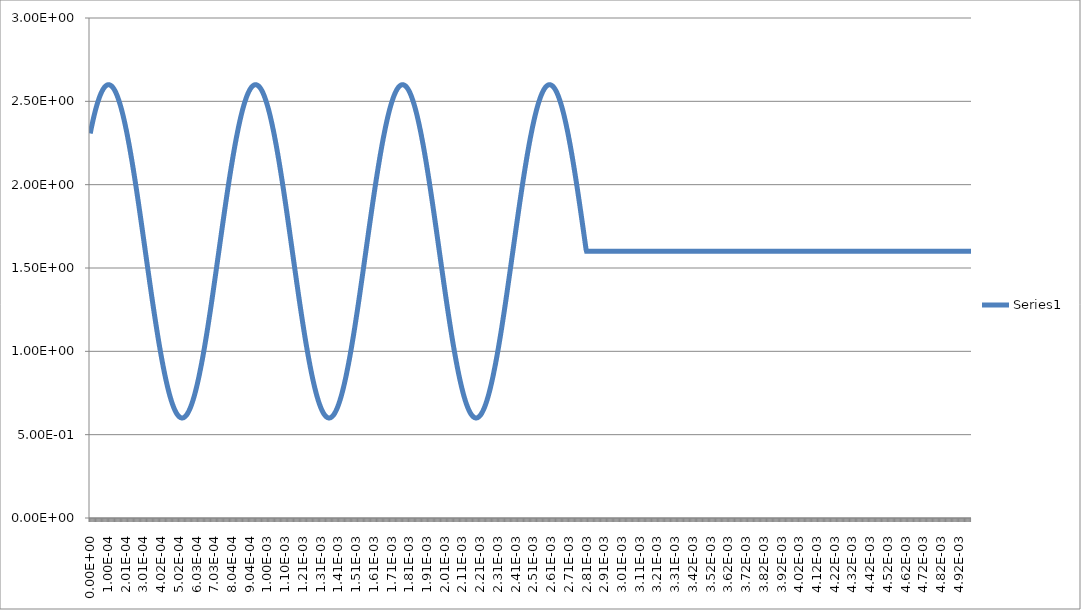
| Category | Series 0 |
|---|---|
| 0.0 | 2.307 |
| 2.45e-06 | 2.32 |
| 4.9e-06 | 2.333 |
| 7.35e-06 | 2.345 |
| 9.8e-06 | 2.357 |
| 1.225e-05 | 2.369 |
| 1.47e-05 | 2.381 |
| 1.715e-05 | 2.392 |
| 1.96e-05 | 2.404 |
| 2.205e-05 | 2.414 |
| 2.45e-05 | 2.425 |
| 2.695e-05 | 2.435 |
| 2.94e-05 | 2.445 |
| 3.185e-05 | 2.455 |
| 3.43e-05 | 2.464 |
| 3.675e-05 | 2.474 |
| 3.92e-05 | 2.482 |
| 4.165e-05 | 2.491 |
| 4.41e-05 | 2.499 |
| 4.655e-05 | 2.507 |
| 4.9e-05 | 2.515 |
| 5.145e-05 | 2.522 |
| 5.39e-05 | 2.529 |
| 5.635e-05 | 2.536 |
| 5.88e-05 | 2.542 |
| 6.125e-05 | 2.548 |
| 6.37e-05 | 2.554 |
| 6.615e-05 | 2.559 |
| 6.86e-05 | 2.564 |
| 7.105e-05 | 2.569 |
| 7.35e-05 | 2.573 |
| 7.595e-05 | 2.578 |
| 7.84e-05 | 2.581 |
| 8.085e-05 | 2.585 |
| 8.33e-05 | 2.588 |
| 8.575e-05 | 2.59 |
| 8.82e-05 | 2.593 |
| 9.065e-05 | 2.595 |
| 9.31e-05 | 2.597 |
| 9.555e-05 | 2.598 |
| 9.8e-05 | 2.599 |
| 0.00010045 | 2.6 |
| 0.0001029 | 2.6 |
| 0.00010535 | 2.6 |
| 0.0001078 | 2.6 |
| 0.00011025 | 2.599 |
| 0.0001127 | 2.598 |
| 0.00011515 | 2.597 |
| 0.0001176 | 2.595 |
| 0.00012005 | 2.593 |
| 0.0001225 | 2.59 |
| 0.00012495 | 2.588 |
| 0.0001274 | 2.585 |
| 0.00012985 | 2.581 |
| 0.0001323 | 2.578 |
| 0.00013475 | 2.573 |
| 0.0001372 | 2.569 |
| 0.00013965 | 2.564 |
| 0.0001421 | 2.559 |
| 0.00014455 | 2.554 |
| 0.000147 | 2.548 |
| 0.00014945 | 2.542 |
| 0.0001519 | 2.536 |
| 0.00015435 | 2.529 |
| 0.0001568 | 2.522 |
| 0.00015925 | 2.515 |
| 0.0001617 | 2.507 |
| 0.00016415 | 2.499 |
| 0.0001666 | 2.491 |
| 0.00016905 | 2.482 |
| 0.0001715 | 2.474 |
| 0.00017395 | 2.464 |
| 0.0001764 | 2.455 |
| 0.00017885 | 2.445 |
| 0.0001813 | 2.435 |
| 0.00018375 | 2.425 |
| 0.0001862 | 2.414 |
| 0.00018865 | 2.404 |
| 0.0001911 | 2.392 |
| 0.00019355 | 2.381 |
| 0.000196 | 2.369 |
| 0.00019845 | 2.357 |
| 0.0002009 | 2.345 |
| 0.00020335 | 2.333 |
| 0.0002058 | 2.32 |
| 0.00020825 | 2.307 |
| 0.0002107 | 2.294 |
| 0.00021315 | 2.28 |
| 0.0002156 | 2.267 |
| 0.00021805 | 2.253 |
| 0.0002205 | 2.239 |
| 0.00022295 | 2.225 |
| 0.0002254 | 2.21 |
| 0.00022785 | 2.195 |
| 0.0002303 | 2.18 |
| 0.00023275 | 2.165 |
| 0.0002352 | 2.15 |
| 0.00023765 | 2.134 |
| 0.0002401 | 2.119 |
| 0.00024255 | 2.103 |
| 0.000245 | 2.087 |
| 0.00024745 | 2.07 |
| 0.0002499 | 2.054 |
| 0.00025235 | 2.037 |
| 0.0002548 | 2.021 |
| 0.00025725 | 2.004 |
| 0.0002597 | 1.987 |
| 0.00026215 | 1.97 |
| 0.0002646 | 1.953 |
| 0.00026705 | 1.935 |
| 0.0002695 | 1.918 |
| 0.00027195 | 1.9 |
| 0.0002744 | 1.883 |
| 0.00027685 | 1.865 |
| 0.0002793 | 1.847 |
| 0.00028175 | 1.829 |
| 0.0002842 | 1.811 |
| 0.00028665 | 1.793 |
| 0.0002891 | 1.775 |
| 0.00029155 | 1.756 |
| 0.000294 | 1.738 |
| 0.00029645 | 1.72 |
| 0.0002989 | 1.701 |
| 0.00030135 | 1.683 |
| 0.0003038 | 1.665 |
| 0.00030625 | 1.646 |
| 0.0003087 | 1.628 |
| 0.00031115 | 1.609 |
| 0.0003136 | 1.591 |
| 0.00031605 | 1.572 |
| 0.0003185 | 1.554 |
| 0.00032095 | 1.535 |
| 0.0003234 | 1.517 |
| 0.00032585 | 1.499 |
| 0.0003283 | 1.48 |
| 0.00033075 | 1.462 |
| 0.0003332 | 1.444 |
| 0.00033565 | 1.425 |
| 0.0003381 | 1.407 |
| 0.00034055 | 1.389 |
| 0.000343 | 1.371 |
| 0.00034545 | 1.353 |
| 0.0003479 | 1.335 |
| 0.00035035 | 1.317 |
| 0.0003528 | 1.3 |
| 0.00035525 | 1.282 |
| 0.0003577 | 1.265 |
| 0.00036015 | 1.247 |
| 0.0003626 | 1.23 |
| 0.00036505 | 1.213 |
| 0.0003675 | 1.196 |
| 0.00036995 | 1.179 |
| 0.0003724 | 1.163 |
| 0.00037485 | 1.146 |
| 0.0003773 | 1.13 |
| 0.00037975 | 1.113 |
| 0.0003822 | 1.097 |
| 0.00038465 | 1.081 |
| 0.0003871 | 1.066 |
| 0.00038955 | 1.05 |
| 0.000392 | 1.035 |
| 0.00039445 | 1.02 |
| 0.0003969 | 1.005 |
| 0.00039935 | 0.99 |
| 0.0004018 | 0.975 |
| 0.00040425 | 0.961 |
| 0.0004067 | 0.947 |
| 0.00040915 | 0.933 |
| 0.0004116 | 0.92 |
| 0.00041405 | 0.906 |
| 0.0004165 | 0.893 |
| 0.00041895 | 0.88 |
| 0.0004214 | 0.867 |
| 0.00042385 | 0.855 |
| 0.0004263 | 0.843 |
| 0.00042875 | 0.831 |
| 0.0004312 | 0.819 |
| 0.00043365 | 0.808 |
| 0.0004361 | 0.796 |
| 0.00043855 | 0.786 |
| 0.000441 | 0.775 |
| 0.00044345 | 0.765 |
| 0.0004459 | 0.755 |
| 0.00044835 | 0.745 |
| 0.0004508 | 0.736 |
| 0.00045325 | 0.726 |
| 0.0004557 | 0.718 |
| 0.00045815 | 0.709 |
| 0.0004606 | 0.701 |
| 0.00046305 | 0.693 |
| 0.0004655 | 0.685 |
| 0.00046795 | 0.678 |
| 0.0004704 | 0.671 |
| 0.00047285 | 0.664 |
| 0.0004753 | 0.658 |
| 0.00047775 | 0.652 |
| 0.0004802 | 0.646 |
| 0.00048265 | 0.641 |
| 0.0004851 | 0.636 |
| 0.00048755 | 0.631 |
| 0.00049 | 0.627 |
| 0.00049245 | 0.622 |
| 0.0004949 | 0.619 |
| 0.00049735 | 0.615 |
| 0.0004998 | 0.612 |
| 0.00050225 | 0.61 |
| 0.0005047 | 0.607 |
| 0.00050715 | 0.605 |
| 0.0005096 | 0.603 |
| 0.00051205 | 0.602 |
| 0.0005145 | 0.601 |
| 0.00051695 | 0.6 |
| 0.0005194 | 0.6 |
| 0.00052185 | 0.6 |
| 0.0005243 | 0.6 |
| 0.00052675 | 0.601 |
| 0.0005292 | 0.602 |
| 0.00053165 | 0.603 |
| 0.0005341 | 0.605 |
| 0.00053655 | 0.607 |
| 0.000539 | 0.61 |
| 0.00054145 | 0.612 |
| 0.0005439 | 0.615 |
| 0.00054635 | 0.619 |
| 0.0005488 | 0.622 |
| 0.00055125 | 0.627 |
| 0.0005537 | 0.631 |
| 0.00055615 | 0.636 |
| 0.0005586 | 0.641 |
| 0.00056105 | 0.646 |
| 0.0005635 | 0.652 |
| 0.00056595 | 0.658 |
| 0.0005684 | 0.664 |
| 0.00057085 | 0.671 |
| 0.0005733 | 0.678 |
| 0.00057575 | 0.685 |
| 0.0005782 | 0.693 |
| 0.00058065 | 0.701 |
| 0.0005831 | 0.709 |
| 0.00058555 | 0.718 |
| 0.000588 | 0.726 |
| 0.00059045 | 0.736 |
| 0.0005929 | 0.745 |
| 0.00059535 | 0.755 |
| 0.0005978 | 0.765 |
| 0.00060025 | 0.775 |
| 0.0006027 | 0.786 |
| 0.00060515 | 0.796 |
| 0.0006076 | 0.808 |
| 0.00061005 | 0.819 |
| 0.0006125 | 0.831 |
| 0.00061495 | 0.843 |
| 0.0006174 | 0.855 |
| 0.00061985 | 0.867 |
| 0.0006223 | 0.88 |
| 0.00062475 | 0.893 |
| 0.0006272 | 0.906 |
| 0.00062965 | 0.92 |
| 0.0006321 | 0.933 |
| 0.00063455 | 0.947 |
| 0.000637 | 0.961 |
| 0.00063945 | 0.975 |
| 0.0006419 | 0.99 |
| 0.00064435 | 1.005 |
| 0.0006468 | 1.02 |
| 0.00064925 | 1.035 |
| 0.0006517 | 1.05 |
| 0.00065415 | 1.066 |
| 0.0006566 | 1.081 |
| 0.00065905 | 1.097 |
| 0.0006615 | 1.113 |
| 0.00066395 | 1.13 |
| 0.0006664 | 1.146 |
| 0.00066885 | 1.163 |
| 0.0006713 | 1.179 |
| 0.00067375 | 1.196 |
| 0.0006762 | 1.213 |
| 0.00067865 | 1.23 |
| 0.0006811 | 1.247 |
| 0.00068355 | 1.265 |
| 0.000686 | 1.282 |
| 0.00068845 | 1.3 |
| 0.0006909 | 1.317 |
| 0.00069335 | 1.335 |
| 0.0006958 | 1.353 |
| 0.00069825 | 1.371 |
| 0.0007007 | 1.389 |
| 0.00070315 | 1.407 |
| 0.0007056 | 1.425 |
| 0.00070805 | 1.444 |
| 0.0007105 | 1.462 |
| 0.00071295 | 1.48 |
| 0.0007154 | 1.499 |
| 0.00071785 | 1.517 |
| 0.0007203 | 1.535 |
| 0.00072275 | 1.554 |
| 0.0007252 | 1.572 |
| 0.00072765 | 1.591 |
| 0.0007301 | 1.609 |
| 0.00073255 | 1.628 |
| 0.000735 | 1.646 |
| 0.00073745 | 1.665 |
| 0.0007399 | 1.683 |
| 0.00074235 | 1.701 |
| 0.0007448 | 1.72 |
| 0.00074725 | 1.738 |
| 0.0007497 | 1.756 |
| 0.00075215 | 1.775 |
| 0.0007546 | 1.793 |
| 0.00075705 | 1.811 |
| 0.0007595 | 1.829 |
| 0.00076195 | 1.847 |
| 0.0007644 | 1.865 |
| 0.00076685 | 1.883 |
| 0.0007693 | 1.9 |
| 0.00077175 | 1.918 |
| 0.0007742 | 1.935 |
| 0.00077665 | 1.953 |
| 0.0007791 | 1.97 |
| 0.00078155 | 1.987 |
| 0.000784 | 2.004 |
| 0.00078645 | 2.021 |
| 0.0007889 | 2.037 |
| 0.00079135 | 2.054 |
| 0.0007938 | 2.07 |
| 0.00079625 | 2.087 |
| 0.0007987 | 2.103 |
| 0.00080115 | 2.119 |
| 0.0008036 | 2.134 |
| 0.00080605 | 2.15 |
| 0.0008085 | 2.165 |
| 0.00081095 | 2.18 |
| 0.0008134 | 2.195 |
| 0.00081585 | 2.21 |
| 0.0008183 | 2.225 |
| 0.00082075 | 2.239 |
| 0.0008232 | 2.253 |
| 0.00082565 | 2.267 |
| 0.0008281 | 2.28 |
| 0.00083055 | 2.294 |
| 0.000833 | 2.307 |
| 0.00083545 | 2.32 |
| 0.0008379 | 2.333 |
| 0.00084035 | 2.345 |
| 0.0008428 | 2.357 |
| 0.00084525 | 2.369 |
| 0.0008477 | 2.381 |
| 0.00085015 | 2.392 |
| 0.0008526 | 2.404 |
| 0.00085505 | 2.414 |
| 0.0008575 | 2.425 |
| 0.00085995 | 2.435 |
| 0.0008624 | 2.445 |
| 0.00086485 | 2.455 |
| 0.0008673 | 2.464 |
| 0.00086975 | 2.474 |
| 0.0008722 | 2.482 |
| 0.00087465 | 2.491 |
| 0.0008771 | 2.499 |
| 0.00087955 | 2.507 |
| 0.000882 | 2.515 |
| 0.00088445 | 2.522 |
| 0.0008869 | 2.529 |
| 0.00088935 | 2.536 |
| 0.0008918 | 2.542 |
| 0.00089425 | 2.548 |
| 0.0008967 | 2.554 |
| 0.00089915 | 2.559 |
| 0.0009016 | 2.564 |
| 0.00090405 | 2.569 |
| 0.0009065 | 2.573 |
| 0.00090895 | 2.578 |
| 0.0009114 | 2.581 |
| 0.00091385 | 2.585 |
| 0.0009163 | 2.588 |
| 0.00091875 | 2.59 |
| 0.0009212 | 2.593 |
| 0.00092365 | 2.595 |
| 0.0009261 | 2.597 |
| 0.00092855 | 2.598 |
| 0.000931 | 2.599 |
| 0.00093345 | 2.6 |
| 0.0009359 | 2.6 |
| 0.00093835 | 2.6 |
| 0.0009408 | 2.6 |
| 0.00094325 | 2.599 |
| 0.0009457 | 2.598 |
| 0.00094815 | 2.597 |
| 0.0009506 | 2.595 |
| 0.00095305 | 2.593 |
| 0.0009555 | 2.59 |
| 0.00095795 | 2.588 |
| 0.0009604 | 2.585 |
| 0.00096285 | 2.581 |
| 0.0009653 | 2.578 |
| 0.00096775 | 2.573 |
| 0.0009702 | 2.569 |
| 0.00097265 | 2.564 |
| 0.0009751 | 2.559 |
| 0.00097755 | 2.554 |
| 0.00098 | 2.548 |
| 0.00098245 | 2.542 |
| 0.0009849 | 2.536 |
| 0.00098735 | 2.529 |
| 0.0009898 | 2.522 |
| 0.00099225 | 2.515 |
| 0.0009947 | 2.507 |
| 0.00099715 | 2.499 |
| 0.0009996 | 2.491 |
| 0.00100205 | 2.482 |
| 0.0010045 | 2.474 |
| 0.00100695 | 2.464 |
| 0.0010094 | 2.455 |
| 0.00101185 | 2.445 |
| 0.0010143 | 2.435 |
| 0.00101675 | 2.425 |
| 0.0010192 | 2.414 |
| 0.00102165 | 2.404 |
| 0.0010241 | 2.392 |
| 0.00102655 | 2.381 |
| 0.001029 | 2.369 |
| 0.00103145 | 2.357 |
| 0.0010339 | 2.345 |
| 0.00103635 | 2.333 |
| 0.0010388 | 2.32 |
| 0.00104125 | 2.307 |
| 0.0010437 | 2.294 |
| 0.00104615 | 2.28 |
| 0.0010486 | 2.267 |
| 0.00105105 | 2.253 |
| 0.0010535 | 2.239 |
| 0.00105595 | 2.225 |
| 0.0010584 | 2.21 |
| 0.00106085 | 2.195 |
| 0.0010633 | 2.18 |
| 0.00106575 | 2.165 |
| 0.0010682 | 2.15 |
| 0.00107065 | 2.134 |
| 0.0010731 | 2.119 |
| 0.00107555 | 2.103 |
| 0.001078 | 2.087 |
| 0.00108045 | 2.07 |
| 0.0010829 | 2.054 |
| 0.00108535 | 2.037 |
| 0.0010878 | 2.021 |
| 0.00109025 | 2.004 |
| 0.0010927 | 1.987 |
| 0.00109515 | 1.97 |
| 0.0010976 | 1.953 |
| 0.00110005 | 1.935 |
| 0.0011025 | 1.918 |
| 0.00110495 | 1.9 |
| 0.0011074 | 1.883 |
| 0.00110985 | 1.865 |
| 0.0011123 | 1.847 |
| 0.00111475 | 1.829 |
| 0.0011172 | 1.811 |
| 0.00111965 | 1.793 |
| 0.0011221 | 1.775 |
| 0.00112455 | 1.756 |
| 0.001127 | 1.738 |
| 0.00112945 | 1.72 |
| 0.0011319 | 1.701 |
| 0.00113435 | 1.683 |
| 0.0011368 | 1.665 |
| 0.00113925 | 1.646 |
| 0.0011417 | 1.628 |
| 0.00114415 | 1.609 |
| 0.0011466 | 1.591 |
| 0.00114905 | 1.572 |
| 0.0011515 | 1.554 |
| 0.00115395 | 1.535 |
| 0.0011564 | 1.517 |
| 0.00115885 | 1.499 |
| 0.0011613 | 1.48 |
| 0.00116375 | 1.462 |
| 0.0011662 | 1.444 |
| 0.00116865 | 1.425 |
| 0.0011711 | 1.407 |
| 0.00117355 | 1.389 |
| 0.001176 | 1.371 |
| 0.00117845 | 1.353 |
| 0.0011809 | 1.335 |
| 0.00118335 | 1.317 |
| 0.0011858 | 1.3 |
| 0.00118825 | 1.282 |
| 0.0011907 | 1.265 |
| 0.00119315 | 1.247 |
| 0.0011956 | 1.23 |
| 0.00119805 | 1.213 |
| 0.0012005 | 1.196 |
| 0.00120295 | 1.179 |
| 0.0012054 | 1.163 |
| 0.00120785 | 1.146 |
| 0.0012103 | 1.13 |
| 0.00121275 | 1.113 |
| 0.0012152 | 1.097 |
| 0.00121765 | 1.081 |
| 0.0012201 | 1.066 |
| 0.00122255 | 1.05 |
| 0.001225 | 1.035 |
| 0.00122745 | 1.02 |
| 0.0012299 | 1.005 |
| 0.00123235 | 0.99 |
| 0.0012348 | 0.975 |
| 0.00123725 | 0.961 |
| 0.0012397 | 0.947 |
| 0.00124215 | 0.933 |
| 0.0012446 | 0.92 |
| 0.00124705 | 0.906 |
| 0.0012495 | 0.893 |
| 0.00125195 | 0.88 |
| 0.0012544 | 0.867 |
| 0.00125685 | 0.855 |
| 0.0012593 | 0.843 |
| 0.00126175 | 0.831 |
| 0.0012642 | 0.819 |
| 0.00126665 | 0.808 |
| 0.0012691 | 0.796 |
| 0.00127155 | 0.786 |
| 0.001274 | 0.775 |
| 0.00127645 | 0.765 |
| 0.0012789 | 0.755 |
| 0.00128135 | 0.745 |
| 0.0012838 | 0.736 |
| 0.00128625 | 0.726 |
| 0.0012887 | 0.718 |
| 0.00129115 | 0.709 |
| 0.0012936 | 0.701 |
| 0.00129605 | 0.693 |
| 0.0012985 | 0.685 |
| 0.00130095 | 0.678 |
| 0.0013034 | 0.671 |
| 0.00130585 | 0.664 |
| 0.0013083 | 0.658 |
| 0.00131075 | 0.652 |
| 0.0013132 | 0.646 |
| 0.00131565 | 0.641 |
| 0.0013181 | 0.636 |
| 0.00132055 | 0.631 |
| 0.001323 | 0.627 |
| 0.00132545 | 0.622 |
| 0.0013279 | 0.619 |
| 0.00133035 | 0.615 |
| 0.0013328 | 0.612 |
| 0.00133525 | 0.61 |
| 0.0013377 | 0.607 |
| 0.00134015 | 0.605 |
| 0.0013426 | 0.603 |
| 0.00134505 | 0.602 |
| 0.0013475 | 0.601 |
| 0.00134995 | 0.6 |
| 0.0013524 | 0.6 |
| 0.00135485 | 0.6 |
| 0.0013573 | 0.6 |
| 0.00135975 | 0.601 |
| 0.0013622 | 0.602 |
| 0.00136465 | 0.603 |
| 0.0013671 | 0.605 |
| 0.00136955 | 0.607 |
| 0.001372 | 0.61 |
| 0.00137445 | 0.612 |
| 0.0013769 | 0.615 |
| 0.00137935 | 0.619 |
| 0.0013818 | 0.622 |
| 0.00138425 | 0.627 |
| 0.0013867 | 0.631 |
| 0.00138915 | 0.636 |
| 0.0013916 | 0.641 |
| 0.00139405 | 0.646 |
| 0.0013965 | 0.652 |
| 0.00139895 | 0.658 |
| 0.0014014 | 0.664 |
| 0.00140385 | 0.671 |
| 0.0014063 | 0.678 |
| 0.00140875 | 0.685 |
| 0.0014112 | 0.693 |
| 0.00141365 | 0.701 |
| 0.0014161 | 0.709 |
| 0.00141855 | 0.718 |
| 0.001421 | 0.726 |
| 0.00142345 | 0.736 |
| 0.0014259 | 0.745 |
| 0.00142835 | 0.755 |
| 0.0014308 | 0.765 |
| 0.00143325 | 0.775 |
| 0.0014357 | 0.786 |
| 0.00143815 | 0.796 |
| 0.0014406 | 0.808 |
| 0.00144305 | 0.819 |
| 0.0014455 | 0.831 |
| 0.00144795 | 0.843 |
| 0.0014504 | 0.855 |
| 0.00145285 | 0.867 |
| 0.0014553 | 0.88 |
| 0.00145775 | 0.893 |
| 0.0014602 | 0.906 |
| 0.00146265 | 0.92 |
| 0.0014651 | 0.933 |
| 0.00146755 | 0.947 |
| 0.00147 | 0.961 |
| 0.00147245 | 0.975 |
| 0.0014749 | 0.99 |
| 0.00147735 | 1.005 |
| 0.0014798 | 1.02 |
| 0.00148225 | 1.035 |
| 0.0014847 | 1.05 |
| 0.00148715 | 1.066 |
| 0.0014896 | 1.081 |
| 0.00149205 | 1.097 |
| 0.0014945 | 1.113 |
| 0.00149695 | 1.13 |
| 0.0014994 | 1.146 |
| 0.00150185 | 1.163 |
| 0.0015043 | 1.179 |
| 0.00150675 | 1.196 |
| 0.0015092 | 1.213 |
| 0.00151165 | 1.23 |
| 0.0015141 | 1.247 |
| 0.00151655 | 1.265 |
| 0.001519 | 1.282 |
| 0.00152145 | 1.3 |
| 0.0015239 | 1.317 |
| 0.00152635 | 1.335 |
| 0.0015288 | 1.353 |
| 0.00153125 | 1.371 |
| 0.0015337 | 1.389 |
| 0.00153615 | 1.407 |
| 0.0015386 | 1.425 |
| 0.00154105 | 1.444 |
| 0.0015435 | 1.462 |
| 0.00154595 | 1.48 |
| 0.0015484 | 1.499 |
| 0.00155085 | 1.517 |
| 0.0015533 | 1.535 |
| 0.00155575 | 1.554 |
| 0.0015582 | 1.572 |
| 0.00156065 | 1.591 |
| 0.0015631 | 1.609 |
| 0.00156555 | 1.628 |
| 0.001568 | 1.646 |
| 0.00157045 | 1.665 |
| 0.0015729 | 1.683 |
| 0.00157535 | 1.701 |
| 0.0015778 | 1.72 |
| 0.00158025 | 1.738 |
| 0.0015827 | 1.756 |
| 0.00158515 | 1.775 |
| 0.0015876 | 1.793 |
| 0.00159005 | 1.811 |
| 0.0015925 | 1.829 |
| 0.00159495 | 1.847 |
| 0.0015974 | 1.865 |
| 0.00159985 | 1.883 |
| 0.0016023 | 1.9 |
| 0.00160475 | 1.918 |
| 0.0016072 | 1.935 |
| 0.00160965 | 1.953 |
| 0.0016121 | 1.97 |
| 0.00161455 | 1.987 |
| 0.001617 | 2.004 |
| 0.00161945 | 2.021 |
| 0.0016219 | 2.037 |
| 0.00162435 | 2.054 |
| 0.0016268 | 2.07 |
| 0.00162925 | 2.087 |
| 0.0016317 | 2.103 |
| 0.00163415 | 2.119 |
| 0.0016366 | 2.134 |
| 0.00163905 | 2.15 |
| 0.0016415 | 2.165 |
| 0.00164395 | 2.18 |
| 0.0016464 | 2.195 |
| 0.00164885 | 2.21 |
| 0.0016513 | 2.225 |
| 0.00165375 | 2.239 |
| 0.0016562 | 2.253 |
| 0.00165865 | 2.267 |
| 0.0016611 | 2.28 |
| 0.00166355 | 2.294 |
| 0.001666 | 2.307 |
| 0.00166845 | 2.32 |
| 0.0016709 | 2.333 |
| 0.00167335 | 2.345 |
| 0.0016758 | 2.357 |
| 0.00167825 | 2.369 |
| 0.0016807 | 2.381 |
| 0.00168315 | 2.392 |
| 0.0016856 | 2.404 |
| 0.00168805 | 2.414 |
| 0.0016905 | 2.425 |
| 0.00169295 | 2.435 |
| 0.0016954 | 2.445 |
| 0.00169785 | 2.455 |
| 0.0017003 | 2.464 |
| 0.00170275 | 2.474 |
| 0.0017052 | 2.482 |
| 0.00170765 | 2.491 |
| 0.0017101 | 2.499 |
| 0.00171255 | 2.507 |
| 0.001715 | 2.515 |
| 0.00171745 | 2.522 |
| 0.0017199 | 2.529 |
| 0.00172235 | 2.536 |
| 0.0017248 | 2.542 |
| 0.00172725 | 2.548 |
| 0.0017297 | 2.554 |
| 0.00173215 | 2.559 |
| 0.0017346 | 2.564 |
| 0.00173705 | 2.569 |
| 0.0017395 | 2.573 |
| 0.00174195 | 2.578 |
| 0.0017444 | 2.581 |
| 0.00174685 | 2.585 |
| 0.0017493 | 2.588 |
| 0.00175175 | 2.59 |
| 0.0017542 | 2.593 |
| 0.00175665 | 2.595 |
| 0.0017591 | 2.597 |
| 0.00176155 | 2.598 |
| 0.001764 | 2.599 |
| 0.00176645 | 2.6 |
| 0.0017689 | 2.6 |
| 0.00177135 | 2.6 |
| 0.0017738 | 2.6 |
| 0.00177625 | 2.599 |
| 0.0017787 | 2.598 |
| 0.00178115 | 2.597 |
| 0.0017836 | 2.595 |
| 0.00178605 | 2.593 |
| 0.0017885 | 2.59 |
| 0.00179095 | 2.588 |
| 0.0017934 | 2.585 |
| 0.00179585 | 2.581 |
| 0.0017983 | 2.578 |
| 0.00180075 | 2.573 |
| 0.0018032 | 2.569 |
| 0.00180565 | 2.564 |
| 0.0018081 | 2.559 |
| 0.00181055 | 2.554 |
| 0.001813 | 2.548 |
| 0.00181545 | 2.542 |
| 0.0018179 | 2.536 |
| 0.00182035 | 2.529 |
| 0.0018228 | 2.522 |
| 0.00182525 | 2.515 |
| 0.0018277 | 2.507 |
| 0.00183015 | 2.499 |
| 0.0018326 | 2.491 |
| 0.00183505 | 2.482 |
| 0.0018375 | 2.474 |
| 0.00183995 | 2.464 |
| 0.0018424 | 2.455 |
| 0.00184485 | 2.445 |
| 0.0018473 | 2.435 |
| 0.00184975 | 2.425 |
| 0.0018522 | 2.414 |
| 0.00185465 | 2.404 |
| 0.0018571 | 2.392 |
| 0.00185955 | 2.381 |
| 0.001862 | 2.369 |
| 0.00186445 | 2.357 |
| 0.0018669 | 2.345 |
| 0.00186935 | 2.333 |
| 0.0018718 | 2.32 |
| 0.00187425 | 2.307 |
| 0.0018767 | 2.294 |
| 0.00187915 | 2.28 |
| 0.0018816 | 2.267 |
| 0.00188405 | 2.253 |
| 0.0018865 | 2.239 |
| 0.00188895 | 2.225 |
| 0.0018914 | 2.21 |
| 0.00189385 | 2.195 |
| 0.0018963 | 2.18 |
| 0.00189875 | 2.165 |
| 0.0019012 | 2.15 |
| 0.00190365 | 2.134 |
| 0.0019061 | 2.119 |
| 0.00190855 | 2.103 |
| 0.001911 | 2.087 |
| 0.00191345 | 2.07 |
| 0.0019159 | 2.054 |
| 0.00191835 | 2.037 |
| 0.0019208 | 2.021 |
| 0.00192325 | 2.004 |
| 0.0019257 | 1.987 |
| 0.00192815 | 1.97 |
| 0.0019306 | 1.953 |
| 0.00193305 | 1.935 |
| 0.0019355 | 1.918 |
| 0.00193795 | 1.9 |
| 0.0019404 | 1.883 |
| 0.00194285 | 1.865 |
| 0.0019453 | 1.847 |
| 0.00194775 | 1.829 |
| 0.0019502 | 1.811 |
| 0.00195265 | 1.793 |
| 0.0019551 | 1.775 |
| 0.00195755 | 1.756 |
| 0.00196 | 1.738 |
| 0.00196245 | 1.72 |
| 0.0019649 | 1.701 |
| 0.00196735 | 1.683 |
| 0.0019698 | 1.665 |
| 0.00197225 | 1.646 |
| 0.0019747 | 1.628 |
| 0.00197715 | 1.609 |
| 0.0019796 | 1.591 |
| 0.00198205 | 1.572 |
| 0.0019845 | 1.554 |
| 0.00198695 | 1.535 |
| 0.0019894 | 1.517 |
| 0.00199185 | 1.499 |
| 0.0019943 | 1.48 |
| 0.00199675 | 1.462 |
| 0.0019992 | 1.444 |
| 0.00200165 | 1.425 |
| 0.0020041 | 1.407 |
| 0.00200655 | 1.389 |
| 0.002009 | 1.371 |
| 0.00201145 | 1.353 |
| 0.0020139 | 1.335 |
| 0.00201635 | 1.317 |
| 0.0020188 | 1.3 |
| 0.00202125 | 1.282 |
| 0.0020237 | 1.265 |
| 0.00202615 | 1.247 |
| 0.0020286 | 1.23 |
| 0.00203105 | 1.213 |
| 0.0020335 | 1.196 |
| 0.00203595 | 1.179 |
| 0.0020384 | 1.163 |
| 0.00204085 | 1.146 |
| 0.0020433 | 1.13 |
| 0.00204575 | 1.113 |
| 0.0020482 | 1.097 |
| 0.00205065 | 1.081 |
| 0.0020531 | 1.066 |
| 0.00205555 | 1.05 |
| 0.002058 | 1.035 |
| 0.00206045 | 1.02 |
| 0.0020629 | 1.005 |
| 0.00206535 | 0.99 |
| 0.0020678 | 0.975 |
| 0.00207025 | 0.961 |
| 0.0020727 | 0.947 |
| 0.00207515 | 0.933 |
| 0.0020776 | 0.92 |
| 0.00208005 | 0.906 |
| 0.0020825 | 0.893 |
| 0.00208495 | 0.88 |
| 0.0020874 | 0.867 |
| 0.00208985 | 0.855 |
| 0.0020923 | 0.843 |
| 0.00209475 | 0.831 |
| 0.0020972 | 0.819 |
| 0.00209965 | 0.808 |
| 0.0021021 | 0.796 |
| 0.00210455 | 0.786 |
| 0.002107 | 0.775 |
| 0.00210945 | 0.765 |
| 0.0021119 | 0.755 |
| 0.00211435 | 0.745 |
| 0.0021168 | 0.736 |
| 0.00211925 | 0.726 |
| 0.0021217 | 0.718 |
| 0.00212415 | 0.709 |
| 0.0021266 | 0.701 |
| 0.00212905 | 0.693 |
| 0.0021315 | 0.685 |
| 0.00213395 | 0.678 |
| 0.0021364 | 0.671 |
| 0.00213885 | 0.664 |
| 0.0021413 | 0.658 |
| 0.00214375 | 0.652 |
| 0.0021462 | 0.646 |
| 0.00214865 | 0.641 |
| 0.0021511 | 0.636 |
| 0.00215355 | 0.631 |
| 0.002156 | 0.627 |
| 0.00215845 | 0.622 |
| 0.0021609 | 0.619 |
| 0.00216335 | 0.615 |
| 0.0021658 | 0.612 |
| 0.00216825 | 0.61 |
| 0.0021707 | 0.607 |
| 0.00217315 | 0.605 |
| 0.0021756 | 0.603 |
| 0.00217805 | 0.602 |
| 0.0021805 | 0.601 |
| 0.00218295 | 0.6 |
| 0.0021854 | 0.6 |
| 0.00218785 | 0.6 |
| 0.0021903 | 0.6 |
| 0.00219275 | 0.601 |
| 0.0021952 | 0.602 |
| 0.00219765 | 0.603 |
| 0.0022001 | 0.605 |
| 0.00220255 | 0.607 |
| 0.002205 | 0.61 |
| 0.00220745 | 0.612 |
| 0.0022099 | 0.615 |
| 0.00221235 | 0.619 |
| 0.0022148 | 0.622 |
| 0.00221725 | 0.627 |
| 0.0022197 | 0.631 |
| 0.00222215 | 0.636 |
| 0.0022246 | 0.641 |
| 0.00222705 | 0.646 |
| 0.0022295 | 0.652 |
| 0.00223195 | 0.658 |
| 0.0022344 | 0.664 |
| 0.00223685 | 0.671 |
| 0.0022393 | 0.678 |
| 0.00224175 | 0.685 |
| 0.0022442 | 0.693 |
| 0.00224665 | 0.701 |
| 0.0022491 | 0.709 |
| 0.00225155 | 0.718 |
| 0.002254 | 0.726 |
| 0.00225645 | 0.736 |
| 0.0022589 | 0.745 |
| 0.00226135 | 0.755 |
| 0.0022638 | 0.765 |
| 0.00226625 | 0.775 |
| 0.0022687 | 0.786 |
| 0.00227115 | 0.796 |
| 0.0022736 | 0.808 |
| 0.00227605 | 0.819 |
| 0.0022785 | 0.831 |
| 0.00228095 | 0.843 |
| 0.0022834 | 0.855 |
| 0.00228585 | 0.867 |
| 0.0022883 | 0.88 |
| 0.00229075 | 0.893 |
| 0.0022932 | 0.906 |
| 0.00229565 | 0.92 |
| 0.0022981 | 0.933 |
| 0.00230055 | 0.947 |
| 0.002303 | 0.961 |
| 0.00230545 | 0.975 |
| 0.0023079 | 0.99 |
| 0.00231035 | 1.005 |
| 0.0023128 | 1.02 |
| 0.00231525 | 1.035 |
| 0.0023177 | 1.05 |
| 0.00232015 | 1.066 |
| 0.0023226 | 1.081 |
| 0.00232505 | 1.097 |
| 0.0023275 | 1.113 |
| 0.00232995 | 1.13 |
| 0.0023324 | 1.146 |
| 0.00233485 | 1.163 |
| 0.0023373 | 1.179 |
| 0.00233975 | 1.196 |
| 0.0023422 | 1.213 |
| 0.00234465 | 1.23 |
| 0.0023471 | 1.247 |
| 0.00234955 | 1.265 |
| 0.002352 | 1.282 |
| 0.00235445 | 1.3 |
| 0.0023569 | 1.317 |
| 0.00235935 | 1.335 |
| 0.0023618 | 1.353 |
| 0.00236425 | 1.371 |
| 0.0023667 | 1.389 |
| 0.00236915 | 1.407 |
| 0.0023716 | 1.425 |
| 0.00237405 | 1.444 |
| 0.0023765 | 1.462 |
| 0.00237895 | 1.48 |
| 0.0023814 | 1.499 |
| 0.00238385 | 1.517 |
| 0.0023863 | 1.535 |
| 0.00238875 | 1.554 |
| 0.0023912 | 1.572 |
| 0.00239365 | 1.591 |
| 0.0023961 | 1.609 |
| 0.00239855 | 1.628 |
| 0.002401 | 1.646 |
| 0.00240345 | 1.665 |
| 0.0024059 | 1.683 |
| 0.00240835 | 1.701 |
| 0.0024108 | 1.72 |
| 0.00241325 | 1.738 |
| 0.0024157 | 1.756 |
| 0.00241815 | 1.775 |
| 0.0024206 | 1.793 |
| 0.00242305 | 1.811 |
| 0.0024255 | 1.829 |
| 0.00242795 | 1.847 |
| 0.0024304 | 1.865 |
| 0.00243285 | 1.883 |
| 0.0024353 | 1.9 |
| 0.00243775 | 1.918 |
| 0.0024402 | 1.935 |
| 0.00244265 | 1.953 |
| 0.0024451 | 1.97 |
| 0.00244755 | 1.987 |
| 0.00245 | 2.004 |
| 0.00245245 | 2.021 |
| 0.0024549 | 2.037 |
| 0.00245735 | 2.054 |
| 0.0024598 | 2.07 |
| 0.00246225 | 2.087 |
| 0.0024647 | 2.103 |
| 0.00246715 | 2.119 |
| 0.0024696 | 2.134 |
| 0.00247205 | 2.15 |
| 0.0024745 | 2.165 |
| 0.00247695 | 2.18 |
| 0.0024794 | 2.195 |
| 0.00248185 | 2.21 |
| 0.0024843 | 2.225 |
| 0.00248675 | 2.239 |
| 0.0024892 | 2.253 |
| 0.00249165 | 2.267 |
| 0.0024941 | 2.28 |
| 0.00249655 | 2.294 |
| 0.002499 | 2.307 |
| 0.00250145 | 2.32 |
| 0.0025039 | 2.333 |
| 0.00250635 | 2.345 |
| 0.0025088 | 2.357 |
| 0.00251125 | 2.369 |
| 0.0025137 | 2.381 |
| 0.00251615 | 2.392 |
| 0.0025186 | 2.404 |
| 0.00252105 | 2.414 |
| 0.0025235 | 2.425 |
| 0.00252595 | 2.435 |
| 0.0025284 | 2.445 |
| 0.00253085 | 2.455 |
| 0.0025333 | 2.464 |
| 0.00253575 | 2.474 |
| 0.0025382 | 2.482 |
| 0.00254065 | 2.491 |
| 0.0025431 | 2.499 |
| 0.00254555 | 2.507 |
| 0.002548 | 2.515 |
| 0.00255045 | 2.522 |
| 0.0025529 | 2.529 |
| 0.00255535 | 2.536 |
| 0.0025578 | 2.542 |
| 0.00256025 | 2.548 |
| 0.0025627 | 2.554 |
| 0.00256515 | 2.559 |
| 0.0025676 | 2.564 |
| 0.00257005 | 2.569 |
| 0.0025725 | 2.573 |
| 0.00257495 | 2.578 |
| 0.0025774 | 2.581 |
| 0.00257985 | 2.585 |
| 0.0025823 | 2.588 |
| 0.00258475 | 2.59 |
| 0.0025872 | 2.593 |
| 0.00258965 | 2.595 |
| 0.0025921 | 2.597 |
| 0.00259455 | 2.598 |
| 0.002597 | 2.599 |
| 0.00259945 | 2.6 |
| 0.0026019 | 2.6 |
| 0.00260435 | 2.6 |
| 0.0026068 | 2.6 |
| 0.00260925 | 2.599 |
| 0.0026117 | 2.598 |
| 0.00261415 | 2.597 |
| 0.0026166 | 2.595 |
| 0.00261905 | 2.593 |
| 0.0026215 | 2.59 |
| 0.00262395 | 2.588 |
| 0.0026264 | 2.585 |
| 0.00262885 | 2.581 |
| 0.0026313 | 2.578 |
| 0.00263375 | 2.573 |
| 0.0026362 | 2.569 |
| 0.00263865 | 2.564 |
| 0.0026411 | 2.559 |
| 0.00264355 | 2.554 |
| 0.002646 | 2.548 |
| 0.00264845 | 2.542 |
| 0.0026509 | 2.536 |
| 0.00265335 | 2.529 |
| 0.0026558 | 2.522 |
| 0.00265825 | 2.515 |
| 0.0026607 | 2.507 |
| 0.00266315 | 2.499 |
| 0.0026656 | 2.491 |
| 0.00266805 | 2.482 |
| 0.0026705 | 2.474 |
| 0.00267295 | 2.464 |
| 0.0026754 | 2.455 |
| 0.00267785 | 2.445 |
| 0.0026803 | 2.435 |
| 0.00268275 | 2.425 |
| 0.0026852 | 2.414 |
| 0.00268765 | 2.404 |
| 0.0026901 | 2.392 |
| 0.00269255 | 2.381 |
| 0.002695 | 2.369 |
| 0.00269745 | 2.357 |
| 0.0026999 | 2.345 |
| 0.00270235 | 2.333 |
| 0.0027048 | 2.32 |
| 0.00270725 | 2.307 |
| 0.0027097 | 2.294 |
| 0.00271215 | 2.28 |
| 0.0027146 | 2.267 |
| 0.00271705 | 2.253 |
| 0.0027195 | 2.239 |
| 0.00272195 | 2.225 |
| 0.0027244 | 2.21 |
| 0.00272685 | 2.195 |
| 0.0027293 | 2.18 |
| 0.00273175 | 2.165 |
| 0.0027342 | 2.15 |
| 0.00273665 | 2.134 |
| 0.0027391 | 2.119 |
| 0.00274155 | 2.103 |
| 0.002744 | 2.087 |
| 0.00274645 | 2.07 |
| 0.0027489 | 2.054 |
| 0.00275135 | 2.037 |
| 0.0027538 | 2.021 |
| 0.00275625 | 2.004 |
| 0.0027587 | 1.987 |
| 0.00276115 | 1.97 |
| 0.0027636 | 1.953 |
| 0.00276605 | 1.935 |
| 0.0027685 | 1.918 |
| 0.00277095 | 1.9 |
| 0.0027734 | 1.883 |
| 0.00277585 | 1.865 |
| 0.0027783 | 1.847 |
| 0.00278075 | 1.829 |
| 0.0027832 | 1.811 |
| 0.00278565 | 1.793 |
| 0.0027881 | 1.775 |
| 0.00279055 | 1.756 |
| 0.002793 | 1.738 |
| 0.00279545 | 1.72 |
| 0.0027979 | 1.701 |
| 0.00280035 | 1.683 |
| 0.0028028 | 1.665 |
| 0.00280525 | 1.646 |
| 0.0028077 | 1.628 |
| 0.00281015 | 1.609 |
| 0.0028126 | 1.6 |
| 0.00281505 | 1.6 |
| 0.0028175 | 1.6 |
| 0.00281995 | 1.6 |
| 0.0028224 | 1.6 |
| 0.00282485 | 1.6 |
| 0.0028273 | 1.6 |
| 0.00282975 | 1.6 |
| 0.0028322 | 1.6 |
| 0.00283465 | 1.6 |
| 0.0028371 | 1.6 |
| 0.00283955 | 1.6 |
| 0.002842 | 1.6 |
| 0.00284445 | 1.6 |
| 0.0028469 | 1.6 |
| 0.00284935 | 1.6 |
| 0.0028518 | 1.6 |
| 0.00285425 | 1.6 |
| 0.0028567 | 1.6 |
| 0.00285915 | 1.6 |
| 0.0028616 | 1.6 |
| 0.00286405 | 1.6 |
| 0.0028665 | 1.6 |
| 0.00286895 | 1.6 |
| 0.0028714 | 1.6 |
| 0.00287385 | 1.6 |
| 0.0028763 | 1.6 |
| 0.00287875 | 1.6 |
| 0.0028812 | 1.6 |
| 0.00288365 | 1.6 |
| 0.0028861 | 1.6 |
| 0.00288855 | 1.6 |
| 0.002891 | 1.6 |
| 0.00289345 | 1.6 |
| 0.0028959 | 1.6 |
| 0.00289835 | 1.6 |
| 0.0029008 | 1.6 |
| 0.00290325 | 1.6 |
| 0.0029057 | 1.6 |
| 0.00290815 | 1.6 |
| 0.0029106 | 1.6 |
| 0.00291305 | 1.6 |
| 0.0029155 | 1.6 |
| 0.00291795 | 1.6 |
| 0.0029204 | 1.6 |
| 0.00292285 | 1.6 |
| 0.0029253 | 1.6 |
| 0.00292775 | 1.6 |
| 0.0029302 | 1.6 |
| 0.00293265 | 1.6 |
| 0.0029351 | 1.6 |
| 0.00293755 | 1.6 |
| 0.00294 | 1.6 |
| 0.00294245 | 1.6 |
| 0.0029449 | 1.6 |
| 0.00294735 | 1.6 |
| 0.0029498 | 1.6 |
| 0.00295225 | 1.6 |
| 0.0029547 | 1.6 |
| 0.00295715 | 1.6 |
| 0.0029596 | 1.6 |
| 0.00296205 | 1.6 |
| 0.0029645 | 1.6 |
| 0.00296695 | 1.6 |
| 0.0029694 | 1.6 |
| 0.00297185 | 1.6 |
| 0.0029743 | 1.6 |
| 0.00297675 | 1.6 |
| 0.0029792 | 1.6 |
| 0.00298165 | 1.6 |
| 0.0029841 | 1.6 |
| 0.00298655 | 1.6 |
| 0.002989 | 1.6 |
| 0.00299145 | 1.6 |
| 0.0029939 | 1.6 |
| 0.00299635 | 1.6 |
| 0.0029988 | 1.6 |
| 0.00300125 | 1.6 |
| 0.0030037 | 1.6 |
| 0.00300615 | 1.6 |
| 0.0030086 | 1.6 |
| 0.00301105 | 1.6 |
| 0.0030135 | 1.6 |
| 0.00301595 | 1.6 |
| 0.0030184 | 1.6 |
| 0.00302085 | 1.6 |
| 0.0030233 | 1.6 |
| 0.00302575 | 1.6 |
| 0.0030282 | 1.6 |
| 0.00303065 | 1.6 |
| 0.0030331 | 1.6 |
| 0.00303555 | 1.6 |
| 0.003038 | 1.6 |
| 0.00304045 | 1.6 |
| 0.0030429 | 1.6 |
| 0.00304535 | 1.6 |
| 0.0030478 | 1.6 |
| 0.00305025 | 1.6 |
| 0.0030527 | 1.6 |
| 0.00305515 | 1.6 |
| 0.0030576 | 1.6 |
| 0.00306005 | 1.6 |
| 0.0030625 | 1.6 |
| 0.00306495 | 1.6 |
| 0.0030674 | 1.6 |
| 0.00306985 | 1.6 |
| 0.0030723 | 1.6 |
| 0.00307475 | 1.6 |
| 0.0030772 | 1.6 |
| 0.00307965 | 1.6 |
| 0.0030821 | 1.6 |
| 0.00308455 | 1.6 |
| 0.003087 | 1.6 |
| 0.00308945 | 1.6 |
| 0.0030919 | 1.6 |
| 0.00309435 | 1.6 |
| 0.0030968 | 1.6 |
| 0.00309925 | 1.6 |
| 0.0031017 | 1.6 |
| 0.00310415 | 1.6 |
| 0.0031066 | 1.6 |
| 0.00310905 | 1.6 |
| 0.0031115 | 1.6 |
| 0.00311395 | 1.6 |
| 0.0031164 | 1.6 |
| 0.00311885 | 1.6 |
| 0.0031213 | 1.6 |
| 0.00312375 | 1.6 |
| 0.0031262 | 1.6 |
| 0.00312865 | 1.6 |
| 0.0031311 | 1.6 |
| 0.00313355 | 1.6 |
| 0.003136 | 1.6 |
| 0.00313845 | 1.6 |
| 0.0031409 | 1.6 |
| 0.00314335 | 1.6 |
| 0.0031458 | 1.6 |
| 0.00314825 | 1.6 |
| 0.0031507 | 1.6 |
| 0.00315315 | 1.6 |
| 0.0031556 | 1.6 |
| 0.00315805 | 1.6 |
| 0.0031605 | 1.6 |
| 0.00316295 | 1.6 |
| 0.0031654 | 1.6 |
| 0.00316785 | 1.6 |
| 0.0031703 | 1.6 |
| 0.00317275 | 1.6 |
| 0.0031752 | 1.6 |
| 0.00317765 | 1.6 |
| 0.0031801 | 1.6 |
| 0.00318255 | 1.6 |
| 0.003185 | 1.6 |
| 0.00318745 | 1.6 |
| 0.0031899 | 1.6 |
| 0.00319235 | 1.6 |
| 0.0031948 | 1.6 |
| 0.00319725 | 1.6 |
| 0.0031997 | 1.6 |
| 0.00320215 | 1.6 |
| 0.0032046 | 1.6 |
| 0.00320705 | 1.6 |
| 0.0032095 | 1.6 |
| 0.00321195 | 1.6 |
| 0.0032144 | 1.6 |
| 0.00321685 | 1.6 |
| 0.0032193 | 1.6 |
| 0.00322175 | 1.6 |
| 0.0032242 | 1.6 |
| 0.00322665 | 1.6 |
| 0.0032291 | 1.6 |
| 0.00323155 | 1.6 |
| 0.003234 | 1.6 |
| 0.00323645 | 1.6 |
| 0.0032389 | 1.6 |
| 0.00324135 | 1.6 |
| 0.0032438 | 1.6 |
| 0.00324625 | 1.6 |
| 0.0032487 | 1.6 |
| 0.00325115 | 1.6 |
| 0.0032536 | 1.6 |
| 0.00325605 | 1.6 |
| 0.0032585 | 1.6 |
| 0.00326095 | 1.6 |
| 0.0032634 | 1.6 |
| 0.00326585 | 1.6 |
| 0.0032683 | 1.6 |
| 0.00327075 | 1.6 |
| 0.0032732 | 1.6 |
| 0.00327565 | 1.6 |
| 0.0032781 | 1.6 |
| 0.00328055 | 1.6 |
| 0.003283 | 1.6 |
| 0.00328545 | 1.6 |
| 0.0032879 | 1.6 |
| 0.00329035 | 1.6 |
| 0.0032928 | 1.6 |
| 0.00329525 | 1.6 |
| 0.0032977 | 1.6 |
| 0.00330015 | 1.6 |
| 0.0033026 | 1.6 |
| 0.00330505 | 1.6 |
| 0.0033075 | 1.6 |
| 0.00330995 | 1.6 |
| 0.0033124 | 1.6 |
| 0.00331485 | 1.6 |
| 0.0033173 | 1.6 |
| 0.00331975 | 1.6 |
| 0.0033222 | 1.6 |
| 0.00332465 | 1.6 |
| 0.0033271 | 1.6 |
| 0.00332955 | 1.6 |
| 0.003332 | 1.6 |
| 0.00333445 | 1.6 |
| 0.0033369 | 1.6 |
| 0.00333935 | 1.6 |
| 0.0033418 | 1.6 |
| 0.00334425 | 1.6 |
| 0.0033467 | 1.6 |
| 0.00334915 | 1.6 |
| 0.0033516 | 1.6 |
| 0.00335405 | 1.6 |
| 0.0033565 | 1.6 |
| 0.00335895 | 1.6 |
| 0.0033614 | 1.6 |
| 0.00336385 | 1.6 |
| 0.0033663 | 1.6 |
| 0.00336875 | 1.6 |
| 0.0033712 | 1.6 |
| 0.00337365 | 1.6 |
| 0.0033761 | 1.6 |
| 0.00337855 | 1.6 |
| 0.003381 | 1.6 |
| 0.00338345 | 1.6 |
| 0.0033859 | 1.6 |
| 0.00338835 | 1.6 |
| 0.0033908 | 1.6 |
| 0.00339325 | 1.6 |
| 0.0033957 | 1.6 |
| 0.00339815 | 1.6 |
| 0.0034006 | 1.6 |
| 0.00340305 | 1.6 |
| 0.0034055 | 1.6 |
| 0.00340795 | 1.6 |
| 0.0034104 | 1.6 |
| 0.00341285 | 1.6 |
| 0.0034153 | 1.6 |
| 0.00341775 | 1.6 |
| 0.0034202 | 1.6 |
| 0.00342265 | 1.6 |
| 0.0034251 | 1.6 |
| 0.00342755 | 1.6 |
| 0.00343 | 1.6 |
| 0.00343245 | 1.6 |
| 0.0034349 | 1.6 |
| 0.00343735 | 1.6 |
| 0.0034398 | 1.6 |
| 0.00344225 | 1.6 |
| 0.0034447 | 1.6 |
| 0.00344715 | 1.6 |
| 0.0034496 | 1.6 |
| 0.00345205 | 1.6 |
| 0.0034545 | 1.6 |
| 0.00345695 | 1.6 |
| 0.0034594 | 1.6 |
| 0.00346185 | 1.6 |
| 0.0034643 | 1.6 |
| 0.00346675 | 1.6 |
| 0.0034692 | 1.6 |
| 0.00347165 | 1.6 |
| 0.0034741 | 1.6 |
| 0.00347655 | 1.6 |
| 0.003479 | 1.6 |
| 0.00348145 | 1.6 |
| 0.0034839 | 1.6 |
| 0.00348635 | 1.6 |
| 0.0034888 | 1.6 |
| 0.00349125 | 1.6 |
| 0.0034937 | 1.6 |
| 0.00349615 | 1.6 |
| 0.0034986 | 1.6 |
| 0.00350105 | 1.6 |
| 0.0035035 | 1.6 |
| 0.00350595 | 1.6 |
| 0.0035084 | 1.6 |
| 0.00351085 | 1.6 |
| 0.0035133 | 1.6 |
| 0.00351575 | 1.6 |
| 0.0035182 | 1.6 |
| 0.00352065 | 1.6 |
| 0.0035231 | 1.6 |
| 0.00352555 | 1.6 |
| 0.003528 | 1.6 |
| 0.00353045 | 1.6 |
| 0.0035329 | 1.6 |
| 0.00353535 | 1.6 |
| 0.0035378 | 1.6 |
| 0.00354025 | 1.6 |
| 0.0035427 | 1.6 |
| 0.00354515 | 1.6 |
| 0.0035476 | 1.6 |
| 0.00355005 | 1.6 |
| 0.0035525 | 1.6 |
| 0.00355495 | 1.6 |
| 0.0035574 | 1.6 |
| 0.00355985 | 1.6 |
| 0.0035623 | 1.6 |
| 0.00356475 | 1.6 |
| 0.0035672 | 1.6 |
| 0.00356965 | 1.6 |
| 0.0035721 | 1.6 |
| 0.00357455 | 1.6 |
| 0.003577 | 1.6 |
| 0.00357945 | 1.6 |
| 0.0035819 | 1.6 |
| 0.00358435 | 1.6 |
| 0.0035868 | 1.6 |
| 0.00358925 | 1.6 |
| 0.0035917 | 1.6 |
| 0.00359415 | 1.6 |
| 0.0035966 | 1.6 |
| 0.00359905 | 1.6 |
| 0.0036015 | 1.6 |
| 0.00360395 | 1.6 |
| 0.0036064 | 1.6 |
| 0.00360885 | 1.6 |
| 0.0036113 | 1.6 |
| 0.00361375 | 1.6 |
| 0.0036162 | 1.6 |
| 0.00361865 | 1.6 |
| 0.0036211 | 1.6 |
| 0.00362355 | 1.6 |
| 0.003626 | 1.6 |
| 0.00362845 | 1.6 |
| 0.0036309 | 1.6 |
| 0.00363335 | 1.6 |
| 0.0036358 | 1.6 |
| 0.00363825 | 1.6 |
| 0.0036407 | 1.6 |
| 0.00364315 | 1.6 |
| 0.0036456 | 1.6 |
| 0.00364805 | 1.6 |
| 0.0036505 | 1.6 |
| 0.00365295 | 1.6 |
| 0.0036554 | 1.6 |
| 0.00365785 | 1.6 |
| 0.0036603 | 1.6 |
| 0.00366275 | 1.6 |
| 0.0036652 | 1.6 |
| 0.00366765 | 1.6 |
| 0.0036701 | 1.6 |
| 0.00367255 | 1.6 |
| 0.003675 | 1.6 |
| 0.00367745 | 1.6 |
| 0.0036799 | 1.6 |
| 0.00368235 | 1.6 |
| 0.0036848 | 1.6 |
| 0.00368725 | 1.6 |
| 0.0036897 | 1.6 |
| 0.00369215 | 1.6 |
| 0.0036946 | 1.6 |
| 0.00369705 | 1.6 |
| 0.0036995 | 1.6 |
| 0.00370195 | 1.6 |
| 0.0037044 | 1.6 |
| 0.00370685 | 1.6 |
| 0.0037093 | 1.6 |
| 0.00371175 | 1.6 |
| 0.0037142 | 1.6 |
| 0.00371665 | 1.6 |
| 0.0037191 | 1.6 |
| 0.00372155 | 1.6 |
| 0.003724 | 1.6 |
| 0.00372645 | 1.6 |
| 0.0037289 | 1.6 |
| 0.00373135 | 1.6 |
| 0.0037338 | 1.6 |
| 0.00373625 | 1.6 |
| 0.0037387 | 1.6 |
| 0.00374115 | 1.6 |
| 0.0037436 | 1.6 |
| 0.00374605 | 1.6 |
| 0.0037485 | 1.6 |
| 0.00375095 | 1.6 |
| 0.0037534 | 1.6 |
| 0.00375585 | 1.6 |
| 0.0037583 | 1.6 |
| 0.00376075 | 1.6 |
| 0.0037632 | 1.6 |
| 0.00376565 | 1.6 |
| 0.0037681 | 1.6 |
| 0.00377055 | 1.6 |
| 0.003773 | 1.6 |
| 0.00377545 | 1.6 |
| 0.0037779 | 1.6 |
| 0.00378035 | 1.6 |
| 0.0037828 | 1.6 |
| 0.00378525 | 1.6 |
| 0.0037877 | 1.6 |
| 0.00379015 | 1.6 |
| 0.0037926 | 1.6 |
| 0.00379505 | 1.6 |
| 0.0037975 | 1.6 |
| 0.00379995 | 1.6 |
| 0.0038024 | 1.6 |
| 0.00380485 | 1.6 |
| 0.0038073 | 1.6 |
| 0.00380975 | 1.6 |
| 0.0038122 | 1.6 |
| 0.00381465 | 1.6 |
| 0.0038171 | 1.6 |
| 0.00381955 | 1.6 |
| 0.003822 | 1.6 |
| 0.00382445 | 1.6 |
| 0.0038269 | 1.6 |
| 0.00382935 | 1.6 |
| 0.0038318 | 1.6 |
| 0.00383425 | 1.6 |
| 0.0038367 | 1.6 |
| 0.00383915 | 1.6 |
| 0.0038416 | 1.6 |
| 0.00384405 | 1.6 |
| 0.0038465 | 1.6 |
| 0.00384895 | 1.6 |
| 0.0038514 | 1.6 |
| 0.00385385 | 1.6 |
| 0.0038563 | 1.6 |
| 0.00385875 | 1.6 |
| 0.0038612 | 1.6 |
| 0.00386365 | 1.6 |
| 0.0038661 | 1.6 |
| 0.00386855 | 1.6 |
| 0.003871 | 1.6 |
| 0.00387345 | 1.6 |
| 0.0038759 | 1.6 |
| 0.00387835 | 1.6 |
| 0.0038808 | 1.6 |
| 0.00388325 | 1.6 |
| 0.0038857 | 1.6 |
| 0.00388815 | 1.6 |
| 0.0038906 | 1.6 |
| 0.00389305 | 1.6 |
| 0.0038955 | 1.6 |
| 0.00389795 | 1.6 |
| 0.0039004 | 1.6 |
| 0.00390285 | 1.6 |
| 0.0039053 | 1.6 |
| 0.00390775 | 1.6 |
| 0.0039102 | 1.6 |
| 0.00391265 | 1.6 |
| 0.0039151 | 1.6 |
| 0.00391755 | 1.6 |
| 0.00392 | 1.6 |
| 0.00392245 | 1.6 |
| 0.0039249 | 1.6 |
| 0.00392735 | 1.6 |
| 0.0039298 | 1.6 |
| 0.00393225 | 1.6 |
| 0.0039347 | 1.6 |
| 0.00393715 | 1.6 |
| 0.0039396 | 1.6 |
| 0.00394205 | 1.6 |
| 0.0039445 | 1.6 |
| 0.00394695 | 1.6 |
| 0.0039494 | 1.6 |
| 0.00395185 | 1.6 |
| 0.0039543 | 1.6 |
| 0.00395675 | 1.6 |
| 0.0039592 | 1.6 |
| 0.00396165 | 1.6 |
| 0.0039641 | 1.6 |
| 0.00396655 | 1.6 |
| 0.003969 | 1.6 |
| 0.00397145 | 1.6 |
| 0.0039739 | 1.6 |
| 0.00397635 | 1.6 |
| 0.0039788 | 1.6 |
| 0.00398125 | 1.6 |
| 0.0039837 | 1.6 |
| 0.00398615 | 1.6 |
| 0.0039886 | 1.6 |
| 0.00399105 | 1.6 |
| 0.0039935 | 1.6 |
| 0.00399595 | 1.6 |
| 0.0039984 | 1.6 |
| 0.00400085 | 1.6 |
| 0.0040033 | 1.6 |
| 0.00400575 | 1.6 |
| 0.0040082 | 1.6 |
| 0.00401065 | 1.6 |
| 0.0040131 | 1.6 |
| 0.00401555 | 1.6 |
| 0.004018 | 1.6 |
| 0.00402045 | 1.6 |
| 0.0040229 | 1.6 |
| 0.00402535 | 1.6 |
| 0.0040278 | 1.6 |
| 0.00403025 | 1.6 |
| 0.0040327 | 1.6 |
| 0.00403515 | 1.6 |
| 0.0040376 | 1.6 |
| 0.00404005 | 1.6 |
| 0.0040425 | 1.6 |
| 0.00404495 | 1.6 |
| 0.0040474 | 1.6 |
| 0.00404985 | 1.6 |
| 0.0040523 | 1.6 |
| 0.00405475 | 1.6 |
| 0.0040572 | 1.6 |
| 0.00405965 | 1.6 |
| 0.0040621 | 1.6 |
| 0.00406455 | 1.6 |
| 0.004067 | 1.6 |
| 0.00406945 | 1.6 |
| 0.0040719 | 1.6 |
| 0.00407435 | 1.6 |
| 0.0040768 | 1.6 |
| 0.00407925 | 1.6 |
| 0.0040817 | 1.6 |
| 0.00408415 | 1.6 |
| 0.0040866 | 1.6 |
| 0.00408905 | 1.6 |
| 0.0040915 | 1.6 |
| 0.00409395 | 1.6 |
| 0.0040964 | 1.6 |
| 0.00409885 | 1.6 |
| 0.0041013 | 1.6 |
| 0.00410375 | 1.6 |
| 0.0041062 | 1.6 |
| 0.00410865 | 1.6 |
| 0.0041111 | 1.6 |
| 0.00411355 | 1.6 |
| 0.004116 | 1.6 |
| 0.00411845 | 1.6 |
| 0.0041209 | 1.6 |
| 0.00412335 | 1.6 |
| 0.0041258 | 1.6 |
| 0.00412825 | 1.6 |
| 0.0041307 | 1.6 |
| 0.00413315 | 1.6 |
| 0.0041356 | 1.6 |
| 0.00413805 | 1.6 |
| 0.0041405 | 1.6 |
| 0.00414295 | 1.6 |
| 0.0041454 | 1.6 |
| 0.00414785 | 1.6 |
| 0.0041503 | 1.6 |
| 0.00415275 | 1.6 |
| 0.0041552 | 1.6 |
| 0.00415765 | 1.6 |
| 0.0041601 | 1.6 |
| 0.00416255 | 1.6 |
| 0.004165 | 1.6 |
| 0.00416745 | 1.6 |
| 0.0041699 | 1.6 |
| 0.00417235 | 1.6 |
| 0.0041748 | 1.6 |
| 0.00417725 | 1.6 |
| 0.0041797 | 1.6 |
| 0.00418215 | 1.6 |
| 0.0041846 | 1.6 |
| 0.00418705 | 1.6 |
| 0.0041895 | 1.6 |
| 0.00419195 | 1.6 |
| 0.0041944 | 1.6 |
| 0.00419685 | 1.6 |
| 0.0041993 | 1.6 |
| 0.00420175 | 1.6 |
| 0.0042042 | 1.6 |
| 0.00420665 | 1.6 |
| 0.0042091 | 1.6 |
| 0.00421155 | 1.6 |
| 0.004214 | 1.6 |
| 0.00421645 | 1.6 |
| 0.0042189 | 1.6 |
| 0.00422135 | 1.6 |
| 0.0042238 | 1.6 |
| 0.00422625 | 1.6 |
| 0.0042287 | 1.6 |
| 0.00423115 | 1.6 |
| 0.0042336 | 1.6 |
| 0.00423605 | 1.6 |
| 0.0042385 | 1.6 |
| 0.00424095 | 1.6 |
| 0.0042434 | 1.6 |
| 0.00424585 | 1.6 |
| 0.0042483 | 1.6 |
| 0.00425075 | 1.6 |
| 0.0042532 | 1.6 |
| 0.00425565 | 1.6 |
| 0.0042581 | 1.6 |
| 0.00426055 | 1.6 |
| 0.004263 | 1.6 |
| 0.00426545 | 1.6 |
| 0.0042679 | 1.6 |
| 0.00427035 | 1.6 |
| 0.0042728 | 1.6 |
| 0.00427525 | 1.6 |
| 0.0042777 | 1.6 |
| 0.00428015 | 1.6 |
| 0.0042826 | 1.6 |
| 0.00428505 | 1.6 |
| 0.0042875 | 1.6 |
| 0.00428995 | 1.6 |
| 0.0042924 | 1.6 |
| 0.00429485 | 1.6 |
| 0.0042973 | 1.6 |
| 0.00429975 | 1.6 |
| 0.0043022 | 1.6 |
| 0.00430465 | 1.6 |
| 0.0043071 | 1.6 |
| 0.00430955 | 1.6 |
| 0.004312 | 1.6 |
| 0.00431445 | 1.6 |
| 0.0043169 | 1.6 |
| 0.00431935 | 1.6 |
| 0.0043218 | 1.6 |
| 0.00432425 | 1.6 |
| 0.0043267 | 1.6 |
| 0.00432915 | 1.6 |
| 0.0043316 | 1.6 |
| 0.00433405 | 1.6 |
| 0.0043365 | 1.6 |
| 0.00433895 | 1.6 |
| 0.0043414 | 1.6 |
| 0.00434385 | 1.6 |
| 0.0043463 | 1.6 |
| 0.00434875 | 1.6 |
| 0.0043512 | 1.6 |
| 0.00435365 | 1.6 |
| 0.0043561 | 1.6 |
| 0.00435855 | 1.6 |
| 0.004361 | 1.6 |
| 0.00436345 | 1.6 |
| 0.0043659 | 1.6 |
| 0.00436835 | 1.6 |
| 0.0043708 | 1.6 |
| 0.00437325 | 1.6 |
| 0.0043757 | 1.6 |
| 0.00437815 | 1.6 |
| 0.0043806 | 1.6 |
| 0.00438305 | 1.6 |
| 0.0043855 | 1.6 |
| 0.00438795 | 1.6 |
| 0.0043904 | 1.6 |
| 0.00439285 | 1.6 |
| 0.0043953 | 1.6 |
| 0.00439775 | 1.6 |
| 0.0044002 | 1.6 |
| 0.00440265 | 1.6 |
| 0.0044051 | 1.6 |
| 0.00440755 | 1.6 |
| 0.00441 | 1.6 |
| 0.00441245 | 1.6 |
| 0.0044149 | 1.6 |
| 0.00441735 | 1.6 |
| 0.0044198 | 1.6 |
| 0.00442225 | 1.6 |
| 0.0044247 | 1.6 |
| 0.00442715 | 1.6 |
| 0.0044296 | 1.6 |
| 0.00443205 | 1.6 |
| 0.0044345 | 1.6 |
| 0.00443695 | 1.6 |
| 0.0044394 | 1.6 |
| 0.00444185 | 1.6 |
| 0.0044443 | 1.6 |
| 0.00444675 | 1.6 |
| 0.0044492 | 1.6 |
| 0.00445165 | 1.6 |
| 0.0044541 | 1.6 |
| 0.00445655 | 1.6 |
| 0.004459 | 1.6 |
| 0.00446145 | 1.6 |
| 0.0044639 | 1.6 |
| 0.00446635 | 1.6 |
| 0.0044688 | 1.6 |
| 0.00447125 | 1.6 |
| 0.0044737 | 1.6 |
| 0.00447615 | 1.6 |
| 0.0044786 | 1.6 |
| 0.00448105 | 1.6 |
| 0.0044835 | 1.6 |
| 0.00448595 | 1.6 |
| 0.0044884 | 1.6 |
| 0.00449085 | 1.6 |
| 0.0044933 | 1.6 |
| 0.00449575 | 1.6 |
| 0.0044982 | 1.6 |
| 0.00450065 | 1.6 |
| 0.0045031 | 1.6 |
| 0.00450555 | 1.6 |
| 0.004508 | 1.6 |
| 0.00451045 | 1.6 |
| 0.0045129 | 1.6 |
| 0.00451535 | 1.6 |
| 0.0045178 | 1.6 |
| 0.00452025 | 1.6 |
| 0.0045227 | 1.6 |
| 0.00452515 | 1.6 |
| 0.0045276 | 1.6 |
| 0.00453005 | 1.6 |
| 0.0045325 | 1.6 |
| 0.00453495 | 1.6 |
| 0.0045374 | 1.6 |
| 0.00453985 | 1.6 |
| 0.0045423 | 1.6 |
| 0.00454475 | 1.6 |
| 0.0045472 | 1.6 |
| 0.00454965 | 1.6 |
| 0.0045521 | 1.6 |
| 0.00455455 | 1.6 |
| 0.004557 | 1.6 |
| 0.00455945 | 1.6 |
| 0.0045619 | 1.6 |
| 0.00456435 | 1.6 |
| 0.0045668 | 1.6 |
| 0.00456925 | 1.6 |
| 0.0045717 | 1.6 |
| 0.00457415 | 1.6 |
| 0.0045766 | 1.6 |
| 0.00457905 | 1.6 |
| 0.0045815 | 1.6 |
| 0.00458395 | 1.6 |
| 0.0045864 | 1.6 |
| 0.00458885 | 1.6 |
| 0.0045913 | 1.6 |
| 0.00459375 | 1.6 |
| 0.0045962 | 1.6 |
| 0.00459865 | 1.6 |
| 0.0046011 | 1.6 |
| 0.00460355 | 1.6 |
| 0.004606 | 1.6 |
| 0.00460845 | 1.6 |
| 0.0046109 | 1.6 |
| 0.00461335 | 1.6 |
| 0.0046158 | 1.6 |
| 0.00461825 | 1.6 |
| 0.0046207 | 1.6 |
| 0.00462315 | 1.6 |
| 0.0046256 | 1.6 |
| 0.00462805 | 1.6 |
| 0.0046305 | 1.6 |
| 0.00463295 | 1.6 |
| 0.0046354 | 1.6 |
| 0.00463785 | 1.6 |
| 0.0046403 | 1.6 |
| 0.00464275 | 1.6 |
| 0.0046452 | 1.6 |
| 0.00464765 | 1.6 |
| 0.0046501 | 1.6 |
| 0.00465255 | 1.6 |
| 0.004655 | 1.6 |
| 0.00465745 | 1.6 |
| 0.0046599 | 1.6 |
| 0.00466235 | 1.6 |
| 0.0046648 | 1.6 |
| 0.00466725 | 1.6 |
| 0.0046697 | 1.6 |
| 0.00467215 | 1.6 |
| 0.0046746 | 1.6 |
| 0.00467705 | 1.6 |
| 0.0046795 | 1.6 |
| 0.00468195 | 1.6 |
| 0.0046844 | 1.6 |
| 0.00468685 | 1.6 |
| 0.0046893 | 1.6 |
| 0.00469175 | 1.6 |
| 0.0046942 | 1.6 |
| 0.00469665 | 1.6 |
| 0.0046991 | 1.6 |
| 0.00470155 | 1.6 |
| 0.004704 | 1.6 |
| 0.00470645 | 1.6 |
| 0.0047089 | 1.6 |
| 0.00471135 | 1.6 |
| 0.0047138 | 1.6 |
| 0.00471625 | 1.6 |
| 0.0047187 | 1.6 |
| 0.00472115 | 1.6 |
| 0.0047236 | 1.6 |
| 0.00472605 | 1.6 |
| 0.0047285 | 1.6 |
| 0.00473095 | 1.6 |
| 0.0047334 | 1.6 |
| 0.00473585 | 1.6 |
| 0.0047383 | 1.6 |
| 0.00474075 | 1.6 |
| 0.0047432 | 1.6 |
| 0.00474565 | 1.6 |
| 0.0047481 | 1.6 |
| 0.00475055 | 1.6 |
| 0.004753 | 1.6 |
| 0.00475545 | 1.6 |
| 0.0047579 | 1.6 |
| 0.00476035 | 1.6 |
| 0.0047628 | 1.6 |
| 0.00476525 | 1.6 |
| 0.0047677 | 1.6 |
| 0.00477015 | 1.6 |
| 0.0047726 | 1.6 |
| 0.00477505 | 1.6 |
| 0.0047775 | 1.6 |
| 0.00477995 | 1.6 |
| 0.0047824 | 1.6 |
| 0.00478485 | 1.6 |
| 0.0047873 | 1.6 |
| 0.00478975 | 1.6 |
| 0.0047922 | 1.6 |
| 0.00479465 | 1.6 |
| 0.0047971 | 1.6 |
| 0.00479955 | 1.6 |
| 0.004802 | 1.6 |
| 0.00480445 | 1.6 |
| 0.0048069 | 1.6 |
| 0.00480935 | 1.6 |
| 0.0048118 | 1.6 |
| 0.00481425 | 1.6 |
| 0.0048167 | 1.6 |
| 0.00481915 | 1.6 |
| 0.0048216 | 1.6 |
| 0.00482405 | 1.6 |
| 0.0048265 | 1.6 |
| 0.00482895 | 1.6 |
| 0.0048314 | 1.6 |
| 0.00483385 | 1.6 |
| 0.0048363 | 1.6 |
| 0.00483875 | 1.6 |
| 0.0048412 | 1.6 |
| 0.00484365 | 1.6 |
| 0.0048461 | 1.6 |
| 0.00484855 | 1.6 |
| 0.004851 | 1.6 |
| 0.00485345 | 1.6 |
| 0.0048559 | 1.6 |
| 0.00485835 | 1.6 |
| 0.0048608 | 1.6 |
| 0.00486325 | 1.6 |
| 0.0048657 | 1.6 |
| 0.00486815 | 1.6 |
| 0.0048706 | 1.6 |
| 0.00487305 | 1.6 |
| 0.0048755 | 1.6 |
| 0.00487795 | 1.6 |
| 0.0048804 | 1.6 |
| 0.00488285 | 1.6 |
| 0.0048853 | 1.6 |
| 0.00488775 | 1.6 |
| 0.0048902 | 1.6 |
| 0.00489265 | 1.6 |
| 0.0048951 | 1.6 |
| 0.00489755 | 1.6 |
| 0.0049 | 1.6 |
| 0.00490245 | 1.6 |
| 0.0049049 | 1.6 |
| 0.00490735 | 1.6 |
| 0.0049098 | 1.6 |
| 0.00491225 | 1.6 |
| 0.0049147 | 1.6 |
| 0.00491715 | 1.6 |
| 0.0049196 | 1.6 |
| 0.00492205 | 1.6 |
| 0.0049245 | 1.6 |
| 0.00492695 | 1.6 |
| 0.0049294 | 1.6 |
| 0.00493185 | 1.6 |
| 0.0049343 | 1.6 |
| 0.00493675 | 1.6 |
| 0.0049392 | 1.6 |
| 0.00494165 | 1.6 |
| 0.0049441 | 1.6 |
| 0.00494655 | 1.6 |
| 0.004949 | 1.6 |
| 0.00495145 | 1.6 |
| 0.0049539 | 1.6 |
| 0.00495635 | 1.6 |
| 0.0049588 | 1.6 |
| 0.00496125 | 1.6 |
| 0.0049637 | 1.6 |
| 0.00496615 | 1.6 |
| 0.0049686 | 1.6 |
| 0.00497105 | 1.6 |
| 0.0049735 | 1.6 |
| 0.00497595 | 1.6 |
| 0.0049784 | 1.6 |
| 0.00498085 | 1.6 |
| 0.0049833 | 1.6 |
| 0.00498575 | 1.6 |
| 0.0049882 | 1.6 |
| 0.00499065 | 1.6 |
| 0.0049931 | 1.6 |
| 0.00499555 | 1.6 |